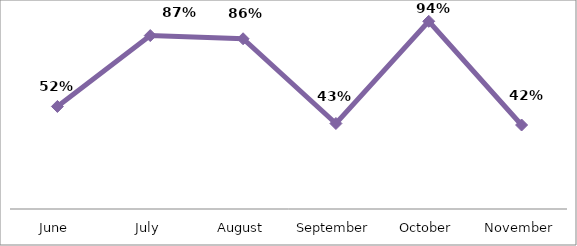
| Category | PERCENTAGE |
|---|---|
| June | 0.515 |
| July | 0.872 |
| August | 0.855 |
| September | 0.43 |
| October | 0.943 |
| November | 0.422 |